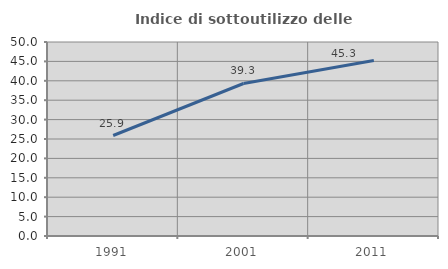
| Category | Indice di sottoutilizzo delle abitazioni  |
|---|---|
| 1991.0 | 25.899 |
| 2001.0 | 39.306 |
| 2011.0 | 45.251 |